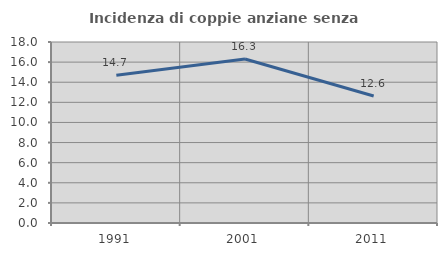
| Category | Incidenza di coppie anziane senza figli  |
|---|---|
| 1991.0 | 14.685 |
| 2001.0 | 16.312 |
| 2011.0 | 12.628 |